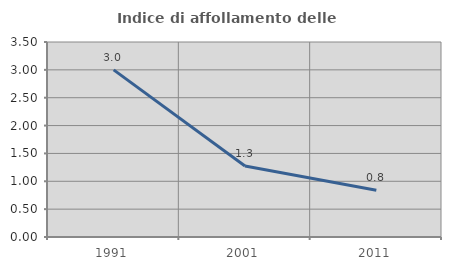
| Category | Indice di affollamento delle abitazioni  |
|---|---|
| 1991.0 | 3 |
| 2001.0 | 1.276 |
| 2011.0 | 0.838 |